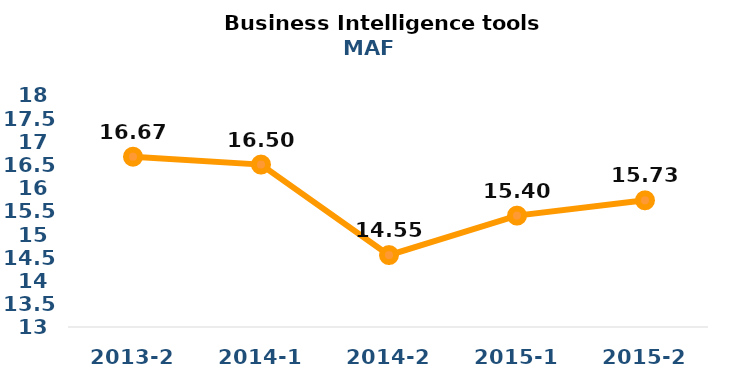
| Category | Series 0 |
|---|---|
| 2013-2 | 16.67 |
| 2014-1 | 16.5 |
| 2014-2 | 14.55 |
| 2015-1 | 15.4 |
| 2015-2 | 15.73 |